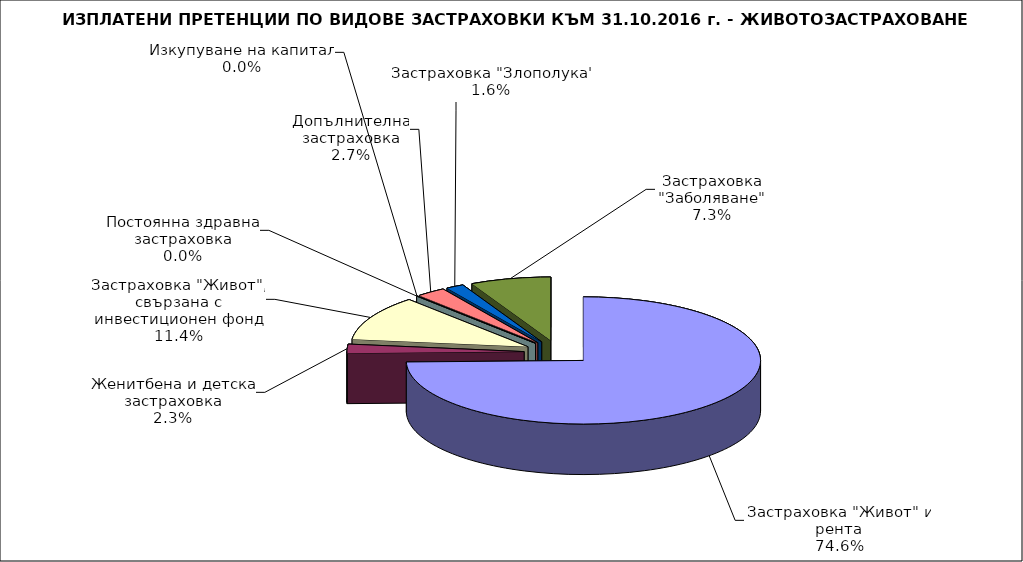
| Category | Series 0 |
|---|---|
| Застраховка "Живот" и рента | 0.746 |
| Женитбена и детска застраховка | 0.023 |
| Застраховка "Живот", свързана с инвестиционен фонд | 0.114 |
| Постоянна здравна застраховка | 0 |
| Изкупуване на капитал | 0 |
| Допълнителна застраховка | 0.027 |
| Застраховка "Злополука" | 0.016 |
| Застраховка "Заболяване" | 0.073 |